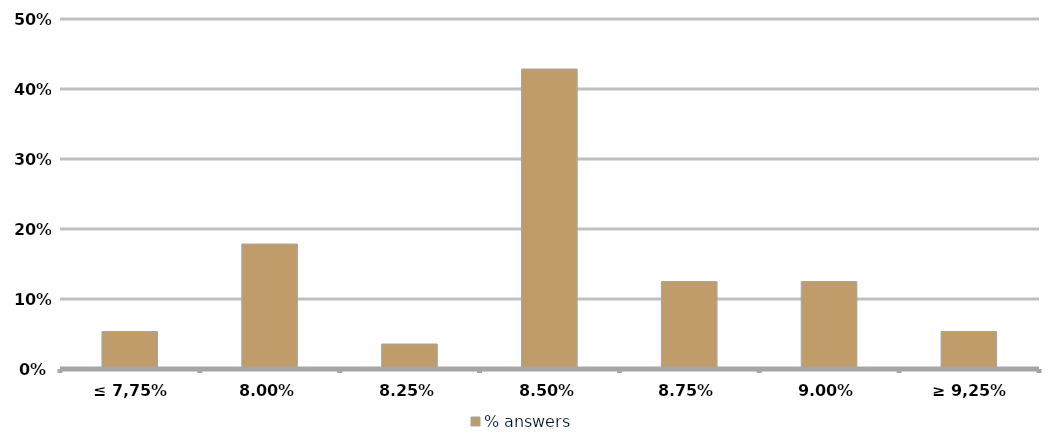
| Category | % answers |
|---|---|
| ≤ 7,75% | 0.054 |
| 8,00% | 0.179 |
| 8,25% | 0.036 |
| 8,50% | 0.429 |
| 8,75% | 0.125 |
| 9,00% | 0.125 |
| ≥ 9,25% | 0.054 |